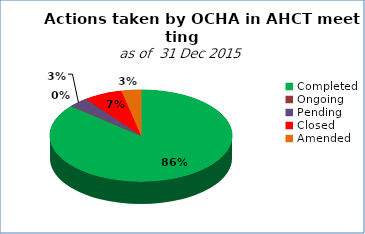
| Category | Series 0 |
|---|---|
| Completed | 25 |
| Ongoing | 0 |
| Pending | 1 |
| Closed | 2 |
| Amended | 1 |